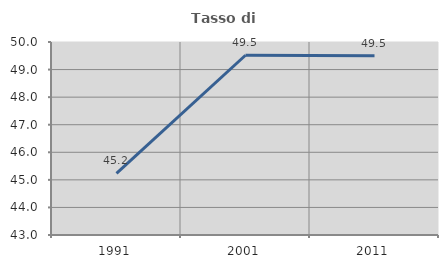
| Category | Tasso di occupazione   |
|---|---|
| 1991.0 | 45.238 |
| 2001.0 | 49.519 |
| 2011.0 | 49.497 |